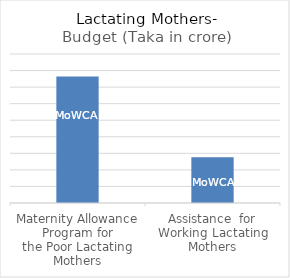
| Category | Budget (Taka in crore) |
|---|---|
| Maternity Allowance Program for
the Poor Lactating Mothers | 764.39 |
| Assistance  for Working Lactating
Mothers | 276.65 |